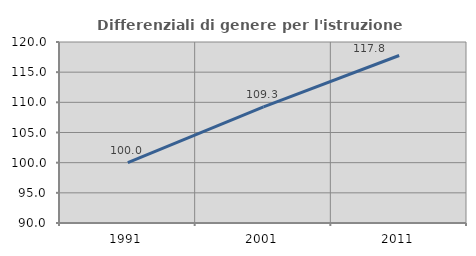
| Category | Differenziali di genere per l'istruzione superiore |
|---|---|
| 1991.0 | 100 |
| 2001.0 | 109.254 |
| 2011.0 | 117.763 |